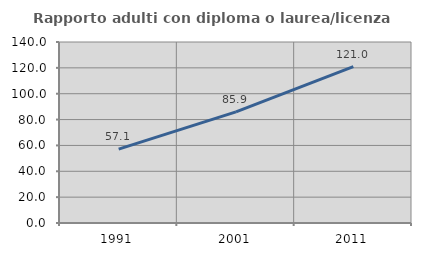
| Category | Rapporto adulti con diploma o laurea/licenza media  |
|---|---|
| 1991.0 | 57.143 |
| 2001.0 | 85.915 |
| 2011.0 | 120.968 |